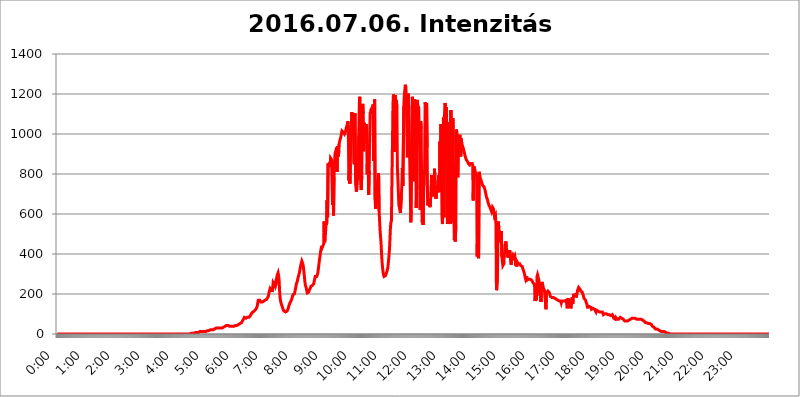
| Category | 2016.07.06. Intenzitás [W/m^2] |
|---|---|
| 0.0 | 0 |
| 0.0006944444444444445 | 0 |
| 0.001388888888888889 | 0 |
| 0.0020833333333333333 | 0 |
| 0.002777777777777778 | 0 |
| 0.003472222222222222 | 0 |
| 0.004166666666666667 | 0 |
| 0.004861111111111111 | 0 |
| 0.005555555555555556 | 0 |
| 0.0062499999999999995 | 0 |
| 0.006944444444444444 | 0 |
| 0.007638888888888889 | 0 |
| 0.008333333333333333 | 0 |
| 0.009027777777777779 | 0 |
| 0.009722222222222222 | 0 |
| 0.010416666666666666 | 0 |
| 0.011111111111111112 | 0 |
| 0.011805555555555555 | 0 |
| 0.012499999999999999 | 0 |
| 0.013194444444444444 | 0 |
| 0.013888888888888888 | 0 |
| 0.014583333333333332 | 0 |
| 0.015277777777777777 | 0 |
| 0.015972222222222224 | 0 |
| 0.016666666666666666 | 0 |
| 0.017361111111111112 | 0 |
| 0.018055555555555557 | 0 |
| 0.01875 | 0 |
| 0.019444444444444445 | 0 |
| 0.02013888888888889 | 0 |
| 0.020833333333333332 | 0 |
| 0.02152777777777778 | 0 |
| 0.022222222222222223 | 0 |
| 0.02291666666666667 | 0 |
| 0.02361111111111111 | 0 |
| 0.024305555555555556 | 0 |
| 0.024999999999999998 | 0 |
| 0.025694444444444447 | 0 |
| 0.02638888888888889 | 0 |
| 0.027083333333333334 | 0 |
| 0.027777777777777776 | 0 |
| 0.02847222222222222 | 0 |
| 0.029166666666666664 | 0 |
| 0.029861111111111113 | 0 |
| 0.030555555555555555 | 0 |
| 0.03125 | 0 |
| 0.03194444444444445 | 0 |
| 0.03263888888888889 | 0 |
| 0.03333333333333333 | 0 |
| 0.034027777777777775 | 0 |
| 0.034722222222222224 | 0 |
| 0.035416666666666666 | 0 |
| 0.036111111111111115 | 0 |
| 0.03680555555555556 | 0 |
| 0.0375 | 0 |
| 0.03819444444444444 | 0 |
| 0.03888888888888889 | 0 |
| 0.03958333333333333 | 0 |
| 0.04027777777777778 | 0 |
| 0.04097222222222222 | 0 |
| 0.041666666666666664 | 0 |
| 0.042361111111111106 | 0 |
| 0.04305555555555556 | 0 |
| 0.043750000000000004 | 0 |
| 0.044444444444444446 | 0 |
| 0.04513888888888889 | 0 |
| 0.04583333333333334 | 0 |
| 0.04652777777777778 | 0 |
| 0.04722222222222222 | 0 |
| 0.04791666666666666 | 0 |
| 0.04861111111111111 | 0 |
| 0.049305555555555554 | 0 |
| 0.049999999999999996 | 0 |
| 0.05069444444444445 | 0 |
| 0.051388888888888894 | 0 |
| 0.052083333333333336 | 0 |
| 0.05277777777777778 | 0 |
| 0.05347222222222222 | 0 |
| 0.05416666666666667 | 0 |
| 0.05486111111111111 | 0 |
| 0.05555555555555555 | 0 |
| 0.05625 | 0 |
| 0.05694444444444444 | 0 |
| 0.057638888888888885 | 0 |
| 0.05833333333333333 | 0 |
| 0.05902777777777778 | 0 |
| 0.059722222222222225 | 0 |
| 0.06041666666666667 | 0 |
| 0.061111111111111116 | 0 |
| 0.06180555555555556 | 0 |
| 0.0625 | 0 |
| 0.06319444444444444 | 0 |
| 0.06388888888888888 | 0 |
| 0.06458333333333334 | 0 |
| 0.06527777777777778 | 0 |
| 0.06597222222222222 | 0 |
| 0.06666666666666667 | 0 |
| 0.06736111111111111 | 0 |
| 0.06805555555555555 | 0 |
| 0.06874999999999999 | 0 |
| 0.06944444444444443 | 0 |
| 0.07013888888888889 | 0 |
| 0.07083333333333333 | 0 |
| 0.07152777777777779 | 0 |
| 0.07222222222222223 | 0 |
| 0.07291666666666667 | 0 |
| 0.07361111111111111 | 0 |
| 0.07430555555555556 | 0 |
| 0.075 | 0 |
| 0.07569444444444444 | 0 |
| 0.0763888888888889 | 0 |
| 0.07708333333333334 | 0 |
| 0.07777777777777778 | 0 |
| 0.07847222222222222 | 0 |
| 0.07916666666666666 | 0 |
| 0.0798611111111111 | 0 |
| 0.08055555555555556 | 0 |
| 0.08125 | 0 |
| 0.08194444444444444 | 0 |
| 0.08263888888888889 | 0 |
| 0.08333333333333333 | 0 |
| 0.08402777777777777 | 0 |
| 0.08472222222222221 | 0 |
| 0.08541666666666665 | 0 |
| 0.08611111111111112 | 0 |
| 0.08680555555555557 | 0 |
| 0.08750000000000001 | 0 |
| 0.08819444444444445 | 0 |
| 0.08888888888888889 | 0 |
| 0.08958333333333333 | 0 |
| 0.09027777777777778 | 0 |
| 0.09097222222222222 | 0 |
| 0.09166666666666667 | 0 |
| 0.09236111111111112 | 0 |
| 0.09305555555555556 | 0 |
| 0.09375 | 0 |
| 0.09444444444444444 | 0 |
| 0.09513888888888888 | 0 |
| 0.09583333333333333 | 0 |
| 0.09652777777777777 | 0 |
| 0.09722222222222222 | 0 |
| 0.09791666666666667 | 0 |
| 0.09861111111111111 | 0 |
| 0.09930555555555555 | 0 |
| 0.09999999999999999 | 0 |
| 0.10069444444444443 | 0 |
| 0.1013888888888889 | 0 |
| 0.10208333333333335 | 0 |
| 0.10277777777777779 | 0 |
| 0.10347222222222223 | 0 |
| 0.10416666666666667 | 0 |
| 0.10486111111111111 | 0 |
| 0.10555555555555556 | 0 |
| 0.10625 | 0 |
| 0.10694444444444444 | 0 |
| 0.1076388888888889 | 0 |
| 0.10833333333333334 | 0 |
| 0.10902777777777778 | 0 |
| 0.10972222222222222 | 0 |
| 0.1111111111111111 | 0 |
| 0.11180555555555556 | 0 |
| 0.11180555555555556 | 0 |
| 0.1125 | 0 |
| 0.11319444444444444 | 0 |
| 0.11388888888888889 | 0 |
| 0.11458333333333333 | 0 |
| 0.11527777777777777 | 0 |
| 0.11597222222222221 | 0 |
| 0.11666666666666665 | 0 |
| 0.1173611111111111 | 0 |
| 0.11805555555555557 | 0 |
| 0.11944444444444445 | 0 |
| 0.12013888888888889 | 0 |
| 0.12083333333333333 | 0 |
| 0.12152777777777778 | 0 |
| 0.12222222222222223 | 0 |
| 0.12291666666666667 | 0 |
| 0.12291666666666667 | 0 |
| 0.12361111111111112 | 0 |
| 0.12430555555555556 | 0 |
| 0.125 | 0 |
| 0.12569444444444444 | 0 |
| 0.12638888888888888 | 0 |
| 0.12708333333333333 | 0 |
| 0.16875 | 0 |
| 0.12847222222222224 | 0 |
| 0.12916666666666668 | 0 |
| 0.12986111111111112 | 0 |
| 0.13055555555555556 | 0 |
| 0.13125 | 0 |
| 0.13194444444444445 | 0 |
| 0.1326388888888889 | 0 |
| 0.13333333333333333 | 0 |
| 0.13402777777777777 | 0 |
| 0.13402777777777777 | 0 |
| 0.13472222222222222 | 0 |
| 0.13541666666666666 | 0 |
| 0.1361111111111111 | 0 |
| 0.13749999999999998 | 0 |
| 0.13819444444444443 | 0 |
| 0.1388888888888889 | 0 |
| 0.13958333333333334 | 0 |
| 0.14027777777777778 | 0 |
| 0.14097222222222222 | 0 |
| 0.14166666666666666 | 0 |
| 0.1423611111111111 | 0 |
| 0.14305555555555557 | 0 |
| 0.14375000000000002 | 0 |
| 0.14444444444444446 | 0 |
| 0.1451388888888889 | 0 |
| 0.1451388888888889 | 0 |
| 0.14652777777777778 | 0 |
| 0.14722222222222223 | 0 |
| 0.14791666666666667 | 0 |
| 0.1486111111111111 | 0 |
| 0.14930555555555555 | 0 |
| 0.15 | 0 |
| 0.15069444444444444 | 0 |
| 0.15138888888888888 | 0 |
| 0.15208333333333332 | 0 |
| 0.15277777777777776 | 0 |
| 0.15347222222222223 | 0 |
| 0.15416666666666667 | 0 |
| 0.15486111111111112 | 0 |
| 0.15555555555555556 | 0 |
| 0.15625 | 0 |
| 0.15694444444444444 | 0 |
| 0.15763888888888888 | 0 |
| 0.15833333333333333 | 0 |
| 0.15902777777777777 | 0 |
| 0.15972222222222224 | 0 |
| 0.16041666666666668 | 0 |
| 0.16111111111111112 | 0 |
| 0.16180555555555556 | 0 |
| 0.1625 | 0 |
| 0.16319444444444445 | 0 |
| 0.1638888888888889 | 0 |
| 0.16458333333333333 | 0 |
| 0.16527777777777777 | 0 |
| 0.16597222222222222 | 0 |
| 0.16666666666666666 | 0 |
| 0.1673611111111111 | 0 |
| 0.16805555555555554 | 0 |
| 0.16874999999999998 | 0 |
| 0.16944444444444443 | 0 |
| 0.17013888888888887 | 0 |
| 0.1708333333333333 | 0 |
| 0.17152777777777775 | 0 |
| 0.17222222222222225 | 0 |
| 0.1729166666666667 | 0 |
| 0.17361111111111113 | 0 |
| 0.17430555555555557 | 0 |
| 0.17500000000000002 | 0 |
| 0.17569444444444446 | 0 |
| 0.1763888888888889 | 0 |
| 0.17708333333333334 | 0 |
| 0.17777777777777778 | 0 |
| 0.17847222222222223 | 0 |
| 0.17916666666666667 | 0 |
| 0.1798611111111111 | 0 |
| 0.18055555555555555 | 0 |
| 0.18125 | 0 |
| 0.18194444444444444 | 0 |
| 0.1826388888888889 | 0 |
| 0.18333333333333335 | 0 |
| 0.1840277777777778 | 0 |
| 0.18472222222222223 | 0 |
| 0.18541666666666667 | 0 |
| 0.18611111111111112 | 0 |
| 0.18680555555555556 | 3.525 |
| 0.1875 | 3.525 |
| 0.18819444444444444 | 3.525 |
| 0.18888888888888888 | 3.525 |
| 0.18958333333333333 | 3.525 |
| 0.19027777777777777 | 3.525 |
| 0.1909722222222222 | 3.525 |
| 0.19166666666666665 | 3.525 |
| 0.19236111111111112 | 3.525 |
| 0.19305555555555554 | 7.887 |
| 0.19375 | 7.887 |
| 0.19444444444444445 | 7.887 |
| 0.1951388888888889 | 7.887 |
| 0.19583333333333333 | 7.887 |
| 0.19652777777777777 | 7.887 |
| 0.19722222222222222 | 12.257 |
| 0.19791666666666666 | 7.887 |
| 0.1986111111111111 | 7.887 |
| 0.19930555555555554 | 12.257 |
| 0.19999999999999998 | 12.257 |
| 0.20069444444444443 | 12.257 |
| 0.20138888888888887 | 12.257 |
| 0.2020833333333333 | 12.257 |
| 0.2027777777777778 | 12.257 |
| 0.2034722222222222 | 12.257 |
| 0.2041666666666667 | 12.257 |
| 0.20486111111111113 | 12.257 |
| 0.20555555555555557 | 12.257 |
| 0.20625000000000002 | 12.257 |
| 0.20694444444444446 | 12.257 |
| 0.2076388888888889 | 12.257 |
| 0.20833333333333334 | 12.257 |
| 0.20902777777777778 | 12.257 |
| 0.20972222222222223 | 12.257 |
| 0.21041666666666667 | 16.636 |
| 0.2111111111111111 | 16.636 |
| 0.21180555555555555 | 16.636 |
| 0.2125 | 16.636 |
| 0.21319444444444444 | 16.636 |
| 0.2138888888888889 | 16.636 |
| 0.21458333333333335 | 21.024 |
| 0.2152777777777778 | 21.024 |
| 0.21597222222222223 | 21.024 |
| 0.21666666666666667 | 21.024 |
| 0.21736111111111112 | 21.024 |
| 0.21805555555555556 | 21.024 |
| 0.21875 | 21.024 |
| 0.21944444444444444 | 25.419 |
| 0.22013888888888888 | 25.419 |
| 0.22083333333333333 | 25.419 |
| 0.22152777777777777 | 29.823 |
| 0.2222222222222222 | 29.823 |
| 0.22291666666666665 | 29.823 |
| 0.2236111111111111 | 29.823 |
| 0.22430555555555556 | 29.823 |
| 0.225 | 29.823 |
| 0.22569444444444445 | 29.823 |
| 0.2263888888888889 | 29.823 |
| 0.22708333333333333 | 29.823 |
| 0.22777777777777777 | 29.823 |
| 0.22847222222222222 | 29.823 |
| 0.22916666666666666 | 29.823 |
| 0.2298611111111111 | 29.823 |
| 0.23055555555555554 | 29.823 |
| 0.23124999999999998 | 29.823 |
| 0.23194444444444443 | 34.234 |
| 0.23263888888888887 | 34.234 |
| 0.2333333333333333 | 34.234 |
| 0.2340277777777778 | 38.653 |
| 0.2347222222222222 | 38.653 |
| 0.2354166666666667 | 38.653 |
| 0.23611111111111113 | 38.653 |
| 0.23680555555555557 | 38.653 |
| 0.23750000000000002 | 43.079 |
| 0.23819444444444446 | 43.079 |
| 0.2388888888888889 | 43.079 |
| 0.23958333333333334 | 43.079 |
| 0.24027777777777778 | 43.079 |
| 0.24097222222222223 | 43.079 |
| 0.24166666666666667 | 38.653 |
| 0.2423611111111111 | 38.653 |
| 0.24305555555555555 | 38.653 |
| 0.24375 | 38.653 |
| 0.24444444444444446 | 38.653 |
| 0.24513888888888888 | 38.653 |
| 0.24583333333333335 | 38.653 |
| 0.2465277777777778 | 38.653 |
| 0.24722222222222223 | 38.653 |
| 0.24791666666666667 | 38.653 |
| 0.24861111111111112 | 38.653 |
| 0.24930555555555556 | 38.653 |
| 0.25 | 43.079 |
| 0.25069444444444444 | 43.079 |
| 0.2513888888888889 | 43.079 |
| 0.2520833333333333 | 43.079 |
| 0.25277777777777777 | 43.079 |
| 0.2534722222222222 | 47.511 |
| 0.25416666666666665 | 47.511 |
| 0.2548611111111111 | 47.511 |
| 0.2555555555555556 | 51.951 |
| 0.25625000000000003 | 51.951 |
| 0.2569444444444445 | 51.951 |
| 0.2576388888888889 | 56.398 |
| 0.25833333333333336 | 56.398 |
| 0.2590277777777778 | 60.85 |
| 0.25972222222222224 | 65.31 |
| 0.2604166666666667 | 69.775 |
| 0.2611111111111111 | 74.246 |
| 0.26180555555555557 | 78.722 |
| 0.2625 | 83.205 |
| 0.26319444444444445 | 83.205 |
| 0.2638888888888889 | 78.722 |
| 0.26458333333333334 | 78.722 |
| 0.2652777777777778 | 83.205 |
| 0.2659722222222222 | 83.205 |
| 0.26666666666666666 | 83.205 |
| 0.2673611111111111 | 83.205 |
| 0.26805555555555555 | 83.205 |
| 0.26875 | 83.205 |
| 0.26944444444444443 | 83.205 |
| 0.2701388888888889 | 87.692 |
| 0.2708333333333333 | 92.184 |
| 0.27152777777777776 | 96.682 |
| 0.2722222222222222 | 101.184 |
| 0.27291666666666664 | 105.69 |
| 0.2736111111111111 | 105.69 |
| 0.2743055555555555 | 110.201 |
| 0.27499999999999997 | 110.201 |
| 0.27569444444444446 | 110.201 |
| 0.27638888888888885 | 114.716 |
| 0.27708333333333335 | 119.235 |
| 0.2777777777777778 | 119.235 |
| 0.27847222222222223 | 123.758 |
| 0.2791666666666667 | 128.284 |
| 0.2798611111111111 | 132.814 |
| 0.28055555555555556 | 141.884 |
| 0.28125 | 146.423 |
| 0.28194444444444444 | 169.156 |
| 0.2826388888888889 | 164.605 |
| 0.2833333333333333 | 169.156 |
| 0.28402777777777777 | 169.156 |
| 0.2847222222222222 | 164.605 |
| 0.28541666666666665 | 160.056 |
| 0.28611111111111115 | 160.056 |
| 0.28680555555555554 | 160.056 |
| 0.28750000000000003 | 160.056 |
| 0.2881944444444445 | 164.605 |
| 0.2888888888888889 | 164.605 |
| 0.28958333333333336 | 164.605 |
| 0.2902777777777778 | 164.605 |
| 0.29097222222222224 | 164.605 |
| 0.2916666666666667 | 169.156 |
| 0.2923611111111111 | 169.156 |
| 0.29305555555555557 | 169.156 |
| 0.29375 | 173.709 |
| 0.29444444444444445 | 173.709 |
| 0.2951388888888889 | 178.264 |
| 0.29583333333333334 | 187.378 |
| 0.2965277777777778 | 196.497 |
| 0.2972222222222222 | 210.182 |
| 0.29791666666666666 | 219.309 |
| 0.2986111111111111 | 228.436 |
| 0.29930555555555555 | 228.436 |
| 0.3 | 223.873 |
| 0.30069444444444443 | 219.309 |
| 0.3013888888888889 | 210.182 |
| 0.3020833333333333 | 228.436 |
| 0.30277777777777776 | 255.813 |
| 0.3034722222222222 | 260.373 |
| 0.30416666666666664 | 251.251 |
| 0.3048611111111111 | 242.127 |
| 0.3055555555555555 | 251.251 |
| 0.30624999999999997 | 242.127 |
| 0.3069444444444444 | 251.251 |
| 0.3076388888888889 | 274.047 |
| 0.30833333333333335 | 292.259 |
| 0.3090277777777778 | 296.808 |
| 0.30972222222222223 | 305.898 |
| 0.3104166666666667 | 292.259 |
| 0.3111111111111111 | 274.047 |
| 0.31180555555555556 | 219.309 |
| 0.3125 | 182.82 |
| 0.31319444444444444 | 164.605 |
| 0.3138888888888889 | 155.509 |
| 0.3145833333333333 | 146.423 |
| 0.31527777777777777 | 141.884 |
| 0.3159722222222222 | 132.814 |
| 0.31666666666666665 | 123.758 |
| 0.31736111111111115 | 119.235 |
| 0.31805555555555554 | 114.716 |
| 0.31875000000000003 | 110.201 |
| 0.3194444444444445 | 110.201 |
| 0.3201388888888889 | 110.201 |
| 0.32083333333333336 | 110.201 |
| 0.3215277777777778 | 110.201 |
| 0.32222222222222224 | 114.716 |
| 0.3229166666666667 | 119.235 |
| 0.3236111111111111 | 123.758 |
| 0.32430555555555557 | 132.814 |
| 0.325 | 141.884 |
| 0.32569444444444445 | 146.423 |
| 0.3263888888888889 | 155.509 |
| 0.32708333333333334 | 160.056 |
| 0.3277777777777778 | 164.605 |
| 0.3284722222222222 | 169.156 |
| 0.32916666666666666 | 178.264 |
| 0.3298611111111111 | 187.378 |
| 0.33055555555555555 | 196.497 |
| 0.33125 | 201.058 |
| 0.33194444444444443 | 196.497 |
| 0.3326388888888889 | 201.058 |
| 0.3333333333333333 | 205.62 |
| 0.3340277777777778 | 223.873 |
| 0.3347222222222222 | 237.564 |
| 0.3354166666666667 | 251.251 |
| 0.3361111111111111 | 255.813 |
| 0.3368055555555556 | 264.932 |
| 0.33749999999999997 | 278.603 |
| 0.33819444444444446 | 287.709 |
| 0.33888888888888885 | 296.808 |
| 0.33958333333333335 | 305.898 |
| 0.34027777777777773 | 319.517 |
| 0.34097222222222223 | 333.113 |
| 0.3416666666666666 | 346.682 |
| 0.3423611111111111 | 355.712 |
| 0.3430555555555555 | 364.728 |
| 0.34375 | 369.23 |
| 0.3444444444444445 | 351.198 |
| 0.3451388888888889 | 337.639 |
| 0.3458333333333334 | 314.98 |
| 0.34652777777777777 | 292.259 |
| 0.34722222222222227 | 264.932 |
| 0.34791666666666665 | 246.689 |
| 0.34861111111111115 | 237.564 |
| 0.34930555555555554 | 228.436 |
| 0.35000000000000003 | 214.746 |
| 0.3506944444444444 | 205.62 |
| 0.3513888888888889 | 201.058 |
| 0.3520833333333333 | 201.058 |
| 0.3527777777777778 | 210.182 |
| 0.3534722222222222 | 219.309 |
| 0.3541666666666667 | 223.873 |
| 0.3548611111111111 | 228.436 |
| 0.35555555555555557 | 237.564 |
| 0.35625 | 242.127 |
| 0.35694444444444445 | 242.127 |
| 0.3576388888888889 | 242.127 |
| 0.35833333333333334 | 242.127 |
| 0.3590277777777778 | 246.689 |
| 0.3597222222222222 | 251.251 |
| 0.36041666666666666 | 264.932 |
| 0.3611111111111111 | 274.047 |
| 0.36180555555555555 | 287.709 |
| 0.3625 | 292.259 |
| 0.36319444444444443 | 292.259 |
| 0.3638888888888889 | 287.709 |
| 0.3645833333333333 | 292.259 |
| 0.3652777777777778 | 301.354 |
| 0.3659722222222222 | 319.517 |
| 0.3666666666666667 | 337.639 |
| 0.3673611111111111 | 360.221 |
| 0.3680555555555556 | 378.224 |
| 0.36874999999999997 | 396.164 |
| 0.36944444444444446 | 414.035 |
| 0.37013888888888885 | 427.39 |
| 0.37083333333333335 | 440.702 |
| 0.37152777777777773 | 431.833 |
| 0.37222222222222223 | 431.833 |
| 0.3729166666666666 | 436.27 |
| 0.3736111111111111 | 449.551 |
| 0.3743055555555555 | 562.53 |
| 0.375 | 458.38 |
| 0.3756944444444445 | 475.972 |
| 0.3763888888888889 | 515.223 |
| 0.3770833333333334 | 558.261 |
| 0.37777777777777777 | 545.416 |
| 0.37847222222222227 | 667.123 |
| 0.37916666666666665 | 583.779 |
| 0.37986111111111115 | 853.029 |
| 0.38055555555555554 | 845.365 |
| 0.38125000000000003 | 833.834 |
| 0.3819444444444444 | 856.855 |
| 0.3826388888888889 | 837.682 |
| 0.3833333333333333 | 879.719 |
| 0.3840277777777778 | 879.719 |
| 0.3847222222222222 | 872.114 |
| 0.3854166666666667 | 875.918 |
| 0.3861111111111111 | 646.537 |
| 0.38680555555555557 | 860.676 |
| 0.3875 | 592.233 |
| 0.38819444444444445 | 787.258 |
| 0.3888888888888889 | 853.029 |
| 0.38958333333333334 | 902.447 |
| 0.3902777777777778 | 906.223 |
| 0.3909722222222222 | 917.534 |
| 0.39166666666666666 | 932.576 |
| 0.3923611111111111 | 810.641 |
| 0.39305555555555555 | 940.082 |
| 0.39375 | 917.534 |
| 0.39444444444444443 | 887.309 |
| 0.3951388888888889 | 947.58 |
| 0.3958333333333333 | 958.814 |
| 0.3965277777777778 | 970.034 |
| 0.3972222222222222 | 977.508 |
| 0.3979166666666667 | 988.714 |
| 0.3986111111111111 | 988.714 |
| 0.3993055555555556 | 1014.852 |
| 0.39999999999999997 | 1011.118 |
| 0.40069444444444446 | 1014.852 |
| 0.40138888888888885 | 1007.383 |
| 0.40208333333333335 | 1003.65 |
| 0.40277777777777773 | 999.916 |
| 0.40347222222222223 | 1003.65 |
| 0.4041666666666666 | 1011.118 |
| 0.4048611111111111 | 1022.323 |
| 0.4055555555555555 | 1033.537 |
| 0.40625 | 1041.019 |
| 0.4069444444444445 | 1048.508 |
| 0.4076388888888889 | 1063.51 |
| 0.4083333333333334 | 992.448 |
| 0.40902777777777777 | 767.62 |
| 0.40972222222222227 | 818.392 |
| 0.41041666666666665 | 751.803 |
| 0.41111111111111115 | 849.199 |
| 0.41180555555555554 | 1041.019 |
| 0.41250000000000003 | 1033.537 |
| 0.4131944444444444 | 1108.816 |
| 0.4138888888888889 | 1108.816 |
| 0.4145833333333333 | 1112.618 |
| 0.4152777777777778 | 1067.267 |
| 0.4159722222222222 | 860.676 |
| 0.4166666666666667 | 849.199 |
| 0.4173611111111111 | 1105.019 |
| 0.41805555555555557 | 1101.226 |
| 0.41875 | 743.859 |
| 0.41944444444444445 | 711.832 |
| 0.4201388888888889 | 723.889 |
| 0.42083333333333334 | 759.723 |
| 0.4215277777777778 | 806.757 |
| 0.4222222222222222 | 795.074 |
| 0.42291666666666666 | 992.448 |
| 0.4236111111111111 | 1135.543 |
| 0.42430555555555555 | 1186.03 |
| 0.425 | 826.123 |
| 0.42569444444444443 | 743.859 |
| 0.4263888888888889 | 719.877 |
| 0.4270833333333333 | 791.169 |
| 0.4277777777777778 | 1093.653 |
| 0.4284722222222222 | 1150.946 |
| 0.4291666666666667 | 1101.226 |
| 0.4298611111111111 | 913.766 |
| 0.4305555555555556 | 1056.004 |
| 0.43124999999999997 | 999.916 |
| 0.43194444444444446 | 1022.323 |
| 0.43263888888888885 | 996.182 |
| 0.43333333333333335 | 1048.508 |
| 0.43402777777777773 | 955.071 |
| 0.43472222222222223 | 798.974 |
| 0.4354166666666666 | 947.58 |
| 0.4361111111111111 | 833.834 |
| 0.4368055555555555 | 695.666 |
| 0.4375 | 814.519 |
| 0.4381944444444445 | 996.182 |
| 0.4388888888888889 | 1108.816 |
| 0.4395833333333334 | 1101.226 |
| 0.44027777777777777 | 1124.056 |
| 0.44097222222222227 | 1124.056 |
| 0.44166666666666665 | 1127.879 |
| 0.44236111111111115 | 1135.543 |
| 0.44305555555555554 | 1147.086 |
| 0.44375000000000003 | 864.493 |
| 0.4444444444444444 | 958.814 |
| 0.4451388888888889 | 1174.263 |
| 0.4458333333333333 | 671.22 |
| 0.4465277777777778 | 625.784 |
| 0.4472222222222222 | 621.613 |
| 0.4479166666666667 | 625.784 |
| 0.4486111111111111 | 711.832 |
| 0.44930555555555557 | 767.62 |
| 0.45 | 755.766 |
| 0.45069444444444445 | 802.868 |
| 0.4513888888888889 | 617.436 |
| 0.45208333333333334 | 566.793 |
| 0.4527777777777778 | 519.555 |
| 0.4534722222222222 | 484.735 |
| 0.45416666666666666 | 453.968 |
| 0.4548611111111111 | 400.638 |
| 0.45555555555555555 | 360.221 |
| 0.45625 | 333.113 |
| 0.45694444444444443 | 310.44 |
| 0.4576388888888889 | 296.808 |
| 0.4583333333333333 | 287.709 |
| 0.4590277777777778 | 283.156 |
| 0.4597222222222222 | 283.156 |
| 0.4604166666666667 | 292.259 |
| 0.4611111111111111 | 296.808 |
| 0.4618055555555556 | 305.898 |
| 0.46249999999999997 | 310.44 |
| 0.46319444444444446 | 324.052 |
| 0.46388888888888885 | 337.639 |
| 0.46458333333333335 | 364.728 |
| 0.46527777777777773 | 391.685 |
| 0.46597222222222223 | 422.943 |
| 0.4666666666666666 | 475.972 |
| 0.4673611111111111 | 536.82 |
| 0.4680555555555555 | 558.261 |
| 0.46875 | 566.793 |
| 0.4694444444444445 | 775.492 |
| 0.4701388888888889 | 947.58 |
| 0.4708333333333334 | 1143.232 |
| 0.47152777777777777 | 1197.876 |
| 0.47222222222222227 | 1189.969 |
| 0.47291666666666665 | 909.996 |
| 0.47361111111111115 | 1093.653 |
| 0.47430555555555554 | 1193.918 |
| 0.47500000000000003 | 1131.708 |
| 0.4756944444444444 | 1170.358 |
| 0.4763888888888889 | 1127.879 |
| 0.4770833333333333 | 829.981 |
| 0.4777777777777778 | 771.559 |
| 0.4784722222222222 | 703.762 |
| 0.4791666666666667 | 642.4 |
| 0.4798611111111111 | 634.105 |
| 0.48055555555555557 | 634.105 |
| 0.48125 | 604.864 |
| 0.48194444444444445 | 600.661 |
| 0.4826388888888889 | 691.608 |
| 0.48333333333333334 | 743.859 |
| 0.4840277777777778 | 829.981 |
| 0.4847222222222222 | 739.877 |
| 0.48541666666666666 | 743.859 |
| 0.4861111111111111 | 1139.384 |
| 0.48680555555555555 | 1193.918 |
| 0.4875 | 1189.969 |
| 0.48819444444444443 | 1246.176 |
| 0.4888888888888889 | 1229.899 |
| 0.4895833333333333 | 1189.969 |
| 0.4902777777777778 | 1029.798 |
| 0.4909722222222222 | 883.516 |
| 0.4916666666666667 | 917.534 |
| 0.4923611111111111 | 1201.843 |
| 0.4930555555555556 | 1112.618 |
| 0.49374999999999997 | 1116.426 |
| 0.49444444444444446 | 1116.426 |
| 0.49513888888888885 | 719.877 |
| 0.49583333333333335 | 558.261 |
| 0.49652777777777773 | 617.436 |
| 0.49722222222222223 | 962.555 |
| 0.4979166666666666 | 1186.03 |
| 0.4986111111111111 | 1166.46 |
| 0.4993055555555555 | 1044.762 |
| 0.5 | 763.674 |
| 0.5006944444444444 | 814.519 |
| 0.5013888888888889 | 1174.263 |
| 0.5020833333333333 | 1174.263 |
| 0.5027777777777778 | 902.447 |
| 0.5034722222222222 | 629.948 |
| 0.5041666666666667 | 743.859 |
| 0.5048611111111111 | 1170.358 |
| 0.5055555555555555 | 1143.232 |
| 0.50625 | 1139.384 |
| 0.5069444444444444 | 1131.708 |
| 0.5076388888888889 | 1127.879 |
| 0.5083333333333333 | 928.819 |
| 0.5090277777777777 | 621.613 |
| 0.5097222222222222 | 1063.51 |
| 0.5104166666666666 | 1026.06 |
| 0.5111111111111112 | 719.877 |
| 0.5118055555555555 | 558.261 |
| 0.5125000000000001 | 579.542 |
| 0.5131944444444444 | 545.416 |
| 0.513888888888889 | 735.89 |
| 0.5145833333333333 | 743.859 |
| 0.5152777777777778 | 833.834 |
| 0.5159722222222222 | 1158.689 |
| 0.5166666666666667 | 1139.384 |
| 0.517361111111111 | 1139.384 |
| 0.5180555555555556 | 1154.814 |
| 0.5187499999999999 | 932.576 |
| 0.5194444444444445 | 642.4 |
| 0.5201388888888888 | 638.256 |
| 0.5208333333333334 | 654.791 |
| 0.5215277777777778 | 663.019 |
| 0.5222222222222223 | 642.4 |
| 0.5229166666666667 | 634.105 |
| 0.5236111111111111 | 671.22 |
| 0.5243055555555556 | 671.22 |
| 0.525 | 795.074 |
| 0.5256944444444445 | 699.717 |
| 0.5263888888888889 | 687.544 |
| 0.5270833333333333 | 747.834 |
| 0.5277777777777778 | 727.896 |
| 0.5284722222222222 | 695.666 |
| 0.5291666666666667 | 826.123 |
| 0.5298611111111111 | 739.877 |
| 0.5305555555555556 | 687.544 |
| 0.53125 | 675.311 |
| 0.5319444444444444 | 679.395 |
| 0.5326388888888889 | 739.877 |
| 0.5333333333333333 | 719.877 |
| 0.5340277777777778 | 707.8 |
| 0.5347222222222222 | 795.074 |
| 0.5354166666666667 | 735.89 |
| 0.5361111111111111 | 711.832 |
| 0.5368055555555555 | 962.555 |
| 0.5375 | 810.641 |
| 0.5381944444444444 | 1048.508 |
| 0.5388888888888889 | 913.766 |
| 0.5395833333333333 | 588.009 |
| 0.5402777777777777 | 549.704 |
| 0.5409722222222222 | 629.948 |
| 0.5416666666666666 | 1082.324 |
| 0.5423611111111112 | 583.779 |
| 0.5430555555555555 | 1086.097 |
| 0.5437500000000001 | 1154.814 |
| 0.5444444444444444 | 1143.232 |
| 0.545138888888889 | 1124.056 |
| 0.5458333333333333 | 1135.543 |
| 0.5465277777777778 | 845.365 |
| 0.5472222222222222 | 549.704 |
| 0.5479166666666667 | 695.666 |
| 0.548611111111111 | 699.717 |
| 0.5493055555555556 | 1059.756 |
| 0.5499999999999999 | 767.62 |
| 0.5506944444444445 | 583.779 |
| 0.5513888888888888 | 549.704 |
| 0.5520833333333334 | 1120.238 |
| 0.5527777777777778 | 558.261 |
| 0.5534722222222223 | 642.4 |
| 0.5541666666666667 | 731.896 |
| 0.5548611111111111 | 1078.555 |
| 0.5555555555555556 | 932.576 |
| 0.55625 | 592.233 |
| 0.5569444444444445 | 471.582 |
| 0.5576388888888889 | 536.82 |
| 0.5583333333333333 | 462.786 |
| 0.5590277777777778 | 545.416 |
| 0.5597222222222222 | 1022.323 |
| 0.5604166666666667 | 1007.383 |
| 0.5611111111111111 | 992.448 |
| 0.5618055555555556 | 783.342 |
| 0.5625 | 947.58 |
| 0.5631944444444444 | 909.996 |
| 0.5638888888888889 | 921.298 |
| 0.5645833333333333 | 996.182 |
| 0.5652777777777778 | 973.772 |
| 0.5659722222222222 | 887.309 |
| 0.5666666666666667 | 977.508 |
| 0.5673611111111111 | 951.327 |
| 0.5680555555555555 | 955.071 |
| 0.56875 | 947.58 |
| 0.5694444444444444 | 928.819 |
| 0.5701388888888889 | 917.534 |
| 0.5708333333333333 | 909.996 |
| 0.5715277777777777 | 898.668 |
| 0.5722222222222222 | 887.309 |
| 0.5729166666666666 | 883.516 |
| 0.5736111111111112 | 872.114 |
| 0.5743055555555555 | 868.305 |
| 0.5750000000000001 | 868.305 |
| 0.5756944444444444 | 860.676 |
| 0.576388888888889 | 853.029 |
| 0.5770833333333333 | 849.199 |
| 0.5777777777777778 | 849.199 |
| 0.5784722222222222 | 845.365 |
| 0.5791666666666667 | 849.199 |
| 0.579861111111111 | 853.029 |
| 0.5805555555555556 | 853.029 |
| 0.5812499999999999 | 853.029 |
| 0.5819444444444445 | 853.029 |
| 0.5826388888888888 | 845.365 |
| 0.5833333333333334 | 667.123 |
| 0.5840277777777778 | 759.723 |
| 0.5847222222222223 | 837.682 |
| 0.5854166666666667 | 826.123 |
| 0.5861111111111111 | 814.519 |
| 0.5868055555555556 | 802.868 |
| 0.5875 | 798.974 |
| 0.5881944444444445 | 791.169 |
| 0.5888888888888889 | 387.202 |
| 0.5895833333333333 | 506.542 |
| 0.5902777777777778 | 467.187 |
| 0.5909722222222222 | 378.224 |
| 0.5916666666666667 | 810.641 |
| 0.5923611111111111 | 798.974 |
| 0.5930555555555556 | 783.342 |
| 0.59375 | 783.342 |
| 0.5944444444444444 | 767.62 |
| 0.5951388888888889 | 759.723 |
| 0.5958333333333333 | 751.803 |
| 0.5965277777777778 | 743.859 |
| 0.5972222222222222 | 747.834 |
| 0.5979166666666667 | 743.859 |
| 0.5986111111111111 | 735.89 |
| 0.5993055555555555 | 727.896 |
| 0.6 | 719.877 |
| 0.6006944444444444 | 707.8 |
| 0.6013888888888889 | 695.666 |
| 0.6020833333333333 | 683.473 |
| 0.6027777777777777 | 679.395 |
| 0.6034722222222222 | 671.22 |
| 0.6041666666666666 | 658.909 |
| 0.6048611111111112 | 650.667 |
| 0.6055555555555555 | 642.4 |
| 0.6062500000000001 | 638.256 |
| 0.6069444444444444 | 634.105 |
| 0.607638888888889 | 625.784 |
| 0.6083333333333333 | 621.613 |
| 0.6090277777777778 | 613.252 |
| 0.6097222222222222 | 613.252 |
| 0.6104166666666667 | 634.105 |
| 0.611111111111111 | 629.948 |
| 0.6118055555555556 | 625.784 |
| 0.6124999999999999 | 621.613 |
| 0.6131944444444445 | 588.009 |
| 0.6138888888888888 | 583.779 |
| 0.6145833333333334 | 596.45 |
| 0.6152777777777778 | 549.704 |
| 0.6159722222222223 | 219.309 |
| 0.6166666666666667 | 228.436 |
| 0.6173611111111111 | 264.932 |
| 0.6180555555555556 | 506.542 |
| 0.61875 | 562.53 |
| 0.6194444444444445 | 515.223 |
| 0.6201388888888889 | 502.192 |
| 0.6208333333333333 | 458.38 |
| 0.6215277777777778 | 458.38 |
| 0.6222222222222222 | 458.38 |
| 0.6229166666666667 | 515.223 |
| 0.6236111111111111 | 387.202 |
| 0.6243055555555556 | 391.685 |
| 0.625 | 342.162 |
| 0.6256944444444444 | 346.682 |
| 0.6263888888888889 | 351.198 |
| 0.6270833333333333 | 409.574 |
| 0.6277777777777778 | 400.638 |
| 0.6284722222222222 | 445.129 |
| 0.6291666666666667 | 462.786 |
| 0.6298611111111111 | 431.833 |
| 0.6305555555555555 | 405.108 |
| 0.63125 | 382.715 |
| 0.6319444444444444 | 387.202 |
| 0.6326388888888889 | 378.224 |
| 0.6333333333333333 | 405.108 |
| 0.6340277777777777 | 409.574 |
| 0.6347222222222222 | 418.492 |
| 0.6354166666666666 | 387.202 |
| 0.6361111111111112 | 355.712 |
| 0.6368055555555555 | 346.682 |
| 0.6375000000000001 | 387.202 |
| 0.6381944444444444 | 387.202 |
| 0.638888888888889 | 396.164 |
| 0.6395833333333333 | 396.164 |
| 0.6402777777777778 | 382.715 |
| 0.6409722222222222 | 382.715 |
| 0.6416666666666667 | 391.685 |
| 0.642361111111111 | 373.729 |
| 0.6430555555555556 | 342.162 |
| 0.6437499999999999 | 360.221 |
| 0.6444444444444445 | 337.639 |
| 0.6451388888888888 | 360.221 |
| 0.6458333333333334 | 360.221 |
| 0.6465277777777778 | 351.198 |
| 0.6472222222222223 | 355.712 |
| 0.6479166666666667 | 355.712 |
| 0.6486111111111111 | 351.198 |
| 0.6493055555555556 | 351.198 |
| 0.65 | 342.162 |
| 0.6506944444444445 | 342.162 |
| 0.6513888888888889 | 342.162 |
| 0.6520833333333333 | 337.639 |
| 0.6527777777777778 | 328.584 |
| 0.6534722222222222 | 324.052 |
| 0.6541666666666667 | 314.98 |
| 0.6548611111111111 | 310.44 |
| 0.6555555555555556 | 296.808 |
| 0.65625 | 283.156 |
| 0.6569444444444444 | 274.047 |
| 0.6576388888888889 | 278.603 |
| 0.6583333333333333 | 287.709 |
| 0.6590277777777778 | 269.49 |
| 0.6597222222222222 | 274.047 |
| 0.6604166666666667 | 274.047 |
| 0.6611111111111111 | 274.047 |
| 0.6618055555555555 | 274.047 |
| 0.6625 | 274.047 |
| 0.6631944444444444 | 274.047 |
| 0.6638888888888889 | 274.047 |
| 0.6645833333333333 | 274.047 |
| 0.6652777777777777 | 269.49 |
| 0.6659722222222222 | 264.932 |
| 0.6666666666666666 | 264.932 |
| 0.6673611111111111 | 255.813 |
| 0.6680555555555556 | 251.251 |
| 0.6687500000000001 | 251.251 |
| 0.6694444444444444 | 246.689 |
| 0.6701388888888888 | 164.605 |
| 0.6708333333333334 | 201.058 |
| 0.6715277777777778 | 169.156 |
| 0.6722222222222222 | 182.82 |
| 0.6729166666666666 | 287.709 |
| 0.6736111111111112 | 296.808 |
| 0.6743055555555556 | 287.709 |
| 0.6749999999999999 | 274.047 |
| 0.6756944444444444 | 264.932 |
| 0.6763888888888889 | 260.373 |
| 0.6770833333333334 | 191.937 |
| 0.6777777777777777 | 219.309 |
| 0.6784722222222223 | 160.056 |
| 0.6791666666666667 | 251.251 |
| 0.6798611111111111 | 260.373 |
| 0.6805555555555555 | 255.813 |
| 0.68125 | 237.564 |
| 0.6819444444444445 | 228.436 |
| 0.6826388888888889 | 223.873 |
| 0.6833333333333332 | 219.309 |
| 0.6840277777777778 | 214.746 |
| 0.6847222222222222 | 160.056 |
| 0.6854166666666667 | 123.758 |
| 0.686111111111111 | 205.62 |
| 0.6868055555555556 | 205.62 |
| 0.6875 | 210.182 |
| 0.6881944444444444 | 214.746 |
| 0.688888888888889 | 219.309 |
| 0.6895833333333333 | 214.746 |
| 0.6902777777777778 | 205.62 |
| 0.6909722222222222 | 196.497 |
| 0.6916666666666668 | 187.378 |
| 0.6923611111111111 | 187.378 |
| 0.6930555555555555 | 187.378 |
| 0.69375 | 182.82 |
| 0.6944444444444445 | 182.82 |
| 0.6951388888888889 | 182.82 |
| 0.6958333333333333 | 182.82 |
| 0.6965277777777777 | 178.264 |
| 0.6972222222222223 | 178.264 |
| 0.6979166666666666 | 178.264 |
| 0.6986111111111111 | 173.709 |
| 0.6993055555555556 | 173.709 |
| 0.7000000000000001 | 173.709 |
| 0.7006944444444444 | 169.156 |
| 0.7013888888888888 | 169.156 |
| 0.7020833333333334 | 169.156 |
| 0.7027777777777778 | 164.605 |
| 0.7034722222222222 | 164.605 |
| 0.7041666666666666 | 164.605 |
| 0.7048611111111112 | 164.605 |
| 0.7055555555555556 | 164.605 |
| 0.7062499999999999 | 164.605 |
| 0.7069444444444444 | 155.509 |
| 0.7076388888888889 | 164.605 |
| 0.7083333333333334 | 164.605 |
| 0.7090277777777777 | 164.605 |
| 0.7097222222222223 | 164.605 |
| 0.7104166666666667 | 164.605 |
| 0.7111111111111111 | 164.605 |
| 0.7118055555555555 | 164.605 |
| 0.7125 | 164.605 |
| 0.7131944444444445 | 164.605 |
| 0.7138888888888889 | 169.156 |
| 0.7145833333333332 | 169.156 |
| 0.7152777777777778 | 128.284 |
| 0.7159722222222222 | 150.964 |
| 0.7166666666666667 | 178.264 |
| 0.717361111111111 | 182.82 |
| 0.7180555555555556 | 164.605 |
| 0.71875 | 146.423 |
| 0.7194444444444444 | 173.709 |
| 0.720138888888889 | 128.284 |
| 0.7208333333333333 | 137.347 |
| 0.7215277777777778 | 155.509 |
| 0.7222222222222222 | 182.82 |
| 0.7229166666666668 | 150.964 |
| 0.7236111111111111 | 169.156 |
| 0.7243055555555555 | 201.058 |
| 0.725 | 191.937 |
| 0.7256944444444445 | 191.937 |
| 0.7263888888888889 | 187.378 |
| 0.7270833333333333 | 196.497 |
| 0.7277777777777777 | 182.82 |
| 0.7284722222222223 | 191.937 |
| 0.7291666666666666 | 205.62 |
| 0.7298611111111111 | 219.309 |
| 0.7305555555555556 | 223.873 |
| 0.7312500000000001 | 233 |
| 0.7319444444444444 | 237.564 |
| 0.7326388888888888 | 228.436 |
| 0.7333333333333334 | 223.873 |
| 0.7340277777777778 | 214.746 |
| 0.7347222222222222 | 214.746 |
| 0.7354166666666666 | 210.182 |
| 0.7361111111111112 | 210.182 |
| 0.7368055555555556 | 205.62 |
| 0.7374999999999999 | 196.497 |
| 0.7381944444444444 | 187.378 |
| 0.7388888888888889 | 178.264 |
| 0.7395833333333334 | 173.709 |
| 0.7402777777777777 | 173.709 |
| 0.7409722222222223 | 169.156 |
| 0.7416666666666667 | 160.056 |
| 0.7423611111111111 | 155.509 |
| 0.7430555555555555 | 146.423 |
| 0.74375 | 128.284 |
| 0.7444444444444445 | 137.347 |
| 0.7451388888888889 | 137.347 |
| 0.7458333333333332 | 137.347 |
| 0.7465277777777778 | 137.347 |
| 0.7472222222222222 | 137.347 |
| 0.7479166666666667 | 132.814 |
| 0.748611111111111 | 132.814 |
| 0.7493055555555556 | 123.758 |
| 0.75 | 128.284 |
| 0.7506944444444444 | 128.284 |
| 0.751388888888889 | 128.284 |
| 0.7520833333333333 | 123.758 |
| 0.7527777777777778 | 123.758 |
| 0.7534722222222222 | 123.758 |
| 0.7541666666666668 | 119.235 |
| 0.7548611111111111 | 119.235 |
| 0.7555555555555555 | 110.201 |
| 0.75625 | 119.235 |
| 0.7569444444444445 | 119.235 |
| 0.7576388888888889 | 114.716 |
| 0.7583333333333333 | 114.716 |
| 0.7590277777777777 | 114.716 |
| 0.7597222222222223 | 110.201 |
| 0.7604166666666666 | 110.201 |
| 0.7611111111111111 | 110.201 |
| 0.7618055555555556 | 110.201 |
| 0.7625000000000001 | 110.201 |
| 0.7631944444444444 | 110.201 |
| 0.7638888888888888 | 110.201 |
| 0.7645833333333334 | 110.201 |
| 0.7652777777777778 | 110.201 |
| 0.7659722222222222 | 96.682 |
| 0.7666666666666666 | 96.682 |
| 0.7673611111111112 | 101.184 |
| 0.7680555555555556 | 101.184 |
| 0.7687499999999999 | 101.184 |
| 0.7694444444444444 | 101.184 |
| 0.7701388888888889 | 101.184 |
| 0.7708333333333334 | 96.682 |
| 0.7715277777777777 | 96.682 |
| 0.7722222222222223 | 96.682 |
| 0.7729166666666667 | 96.682 |
| 0.7736111111111111 | 96.682 |
| 0.7743055555555555 | 96.682 |
| 0.775 | 96.682 |
| 0.7756944444444445 | 92.184 |
| 0.7763888888888889 | 92.184 |
| 0.7770833333333332 | 92.184 |
| 0.7777777777777778 | 96.682 |
| 0.7784722222222222 | 96.682 |
| 0.7791666666666667 | 96.682 |
| 0.779861111111111 | 92.184 |
| 0.7805555555555556 | 78.722 |
| 0.78125 | 74.246 |
| 0.7819444444444444 | 74.246 |
| 0.782638888888889 | 74.246 |
| 0.7833333333333333 | 83.205 |
| 0.7840277777777778 | 78.722 |
| 0.7847222222222222 | 78.722 |
| 0.7854166666666668 | 74.246 |
| 0.7861111111111111 | 74.246 |
| 0.7868055555555555 | 74.246 |
| 0.7875 | 74.246 |
| 0.7881944444444445 | 74.246 |
| 0.7888888888888889 | 78.722 |
| 0.7895833333333333 | 83.205 |
| 0.7902777777777777 | 83.205 |
| 0.7909722222222223 | 83.205 |
| 0.7916666666666666 | 78.722 |
| 0.7923611111111111 | 78.722 |
| 0.7930555555555556 | 74.246 |
| 0.7937500000000001 | 74.246 |
| 0.7944444444444444 | 69.775 |
| 0.7951388888888888 | 69.775 |
| 0.7958333333333334 | 65.31 |
| 0.7965277777777778 | 65.31 |
| 0.7972222222222222 | 65.31 |
| 0.7979166666666666 | 65.31 |
| 0.7986111111111112 | 65.31 |
| 0.7993055555555556 | 65.31 |
| 0.7999999999999999 | 65.31 |
| 0.8006944444444444 | 65.31 |
| 0.8013888888888889 | 65.31 |
| 0.8020833333333334 | 69.775 |
| 0.8027777777777777 | 69.775 |
| 0.8034722222222223 | 74.246 |
| 0.8041666666666667 | 74.246 |
| 0.8048611111111111 | 74.246 |
| 0.8055555555555555 | 78.722 |
| 0.80625 | 78.722 |
| 0.8069444444444445 | 83.205 |
| 0.8076388888888889 | 83.205 |
| 0.8083333333333332 | 78.722 |
| 0.8090277777777778 | 78.722 |
| 0.8097222222222222 | 78.722 |
| 0.8104166666666667 | 78.722 |
| 0.811111111111111 | 74.246 |
| 0.8118055555555556 | 74.246 |
| 0.8125 | 74.246 |
| 0.8131944444444444 | 74.246 |
| 0.813888888888889 | 74.246 |
| 0.8145833333333333 | 74.246 |
| 0.8152777777777778 | 74.246 |
| 0.8159722222222222 | 74.246 |
| 0.8166666666666668 | 74.246 |
| 0.8173611111111111 | 74.246 |
| 0.8180555555555555 | 74.246 |
| 0.81875 | 74.246 |
| 0.8194444444444445 | 74.246 |
| 0.8201388888888889 | 69.775 |
| 0.8208333333333333 | 69.775 |
| 0.8215277777777777 | 65.31 |
| 0.8222222222222223 | 65.31 |
| 0.8229166666666666 | 65.31 |
| 0.8236111111111111 | 60.85 |
| 0.8243055555555556 | 60.85 |
| 0.8250000000000001 | 56.398 |
| 0.8256944444444444 | 56.398 |
| 0.8263888888888888 | 56.398 |
| 0.8270833333333334 | 56.398 |
| 0.8277777777777778 | 56.398 |
| 0.8284722222222222 | 56.398 |
| 0.8291666666666666 | 51.951 |
| 0.8298611111111112 | 51.951 |
| 0.8305555555555556 | 51.951 |
| 0.8312499999999999 | 51.951 |
| 0.8319444444444444 | 51.951 |
| 0.8326388888888889 | 47.511 |
| 0.8333333333333334 | 47.511 |
| 0.8340277777777777 | 43.079 |
| 0.8347222222222223 | 38.653 |
| 0.8354166666666667 | 38.653 |
| 0.8361111111111111 | 34.234 |
| 0.8368055555555555 | 34.234 |
| 0.8375 | 29.823 |
| 0.8381944444444445 | 29.823 |
| 0.8388888888888889 | 25.419 |
| 0.8395833333333332 | 25.419 |
| 0.8402777777777778 | 25.419 |
| 0.8409722222222222 | 25.419 |
| 0.8416666666666667 | 21.024 |
| 0.842361111111111 | 21.024 |
| 0.8430555555555556 | 21.024 |
| 0.84375 | 16.636 |
| 0.8444444444444444 | 16.636 |
| 0.845138888888889 | 16.636 |
| 0.8458333333333333 | 16.636 |
| 0.8465277777777778 | 16.636 |
| 0.8472222222222222 | 12.257 |
| 0.8479166666666668 | 12.257 |
| 0.8486111111111111 | 12.257 |
| 0.8493055555555555 | 12.257 |
| 0.85 | 12.257 |
| 0.8506944444444445 | 12.257 |
| 0.8513888888888889 | 12.257 |
| 0.8520833333333333 | 7.887 |
| 0.8527777777777777 | 7.887 |
| 0.8534722222222223 | 7.887 |
| 0.8541666666666666 | 7.887 |
| 0.8548611111111111 | 3.525 |
| 0.8555555555555556 | 3.525 |
| 0.8562500000000001 | 3.525 |
| 0.8569444444444444 | 3.525 |
| 0.8576388888888888 | 3.525 |
| 0.8583333333333334 | 3.525 |
| 0.8590277777777778 | 3.525 |
| 0.8597222222222222 | 0 |
| 0.8604166666666666 | 0 |
| 0.8611111111111112 | 0 |
| 0.8618055555555556 | 0 |
| 0.8624999999999999 | 0 |
| 0.8631944444444444 | 0 |
| 0.8638888888888889 | 0 |
| 0.8645833333333334 | 0 |
| 0.8652777777777777 | 0 |
| 0.8659722222222223 | 0 |
| 0.8666666666666667 | 0 |
| 0.8673611111111111 | 0 |
| 0.8680555555555555 | 0 |
| 0.86875 | 0 |
| 0.8694444444444445 | 0 |
| 0.8701388888888889 | 0 |
| 0.8708333333333332 | 0 |
| 0.8715277777777778 | 0 |
| 0.8722222222222222 | 0 |
| 0.8729166666666667 | 0 |
| 0.873611111111111 | 0 |
| 0.8743055555555556 | 0 |
| 0.875 | 0 |
| 0.8756944444444444 | 0 |
| 0.876388888888889 | 0 |
| 0.8770833333333333 | 0 |
| 0.8777777777777778 | 0 |
| 0.8784722222222222 | 0 |
| 0.8791666666666668 | 0 |
| 0.8798611111111111 | 0 |
| 0.8805555555555555 | 0 |
| 0.88125 | 0 |
| 0.8819444444444445 | 0 |
| 0.8826388888888889 | 0 |
| 0.8833333333333333 | 0 |
| 0.8840277777777777 | 0 |
| 0.8847222222222223 | 0 |
| 0.8854166666666666 | 0 |
| 0.8861111111111111 | 0 |
| 0.8868055555555556 | 0 |
| 0.8875000000000001 | 0 |
| 0.8881944444444444 | 0 |
| 0.8888888888888888 | 0 |
| 0.8895833333333334 | 0 |
| 0.8902777777777778 | 0 |
| 0.8909722222222222 | 0 |
| 0.8916666666666666 | 0 |
| 0.8923611111111112 | 0 |
| 0.8930555555555556 | 0 |
| 0.8937499999999999 | 0 |
| 0.8944444444444444 | 0 |
| 0.8951388888888889 | 0 |
| 0.8958333333333334 | 0 |
| 0.8965277777777777 | 0 |
| 0.8972222222222223 | 0 |
| 0.8979166666666667 | 0 |
| 0.8986111111111111 | 0 |
| 0.8993055555555555 | 0 |
| 0.9 | 0 |
| 0.9006944444444445 | 0 |
| 0.9013888888888889 | 0 |
| 0.9020833333333332 | 0 |
| 0.9027777777777778 | 0 |
| 0.9034722222222222 | 0 |
| 0.9041666666666667 | 0 |
| 0.904861111111111 | 0 |
| 0.9055555555555556 | 0 |
| 0.90625 | 0 |
| 0.9069444444444444 | 0 |
| 0.907638888888889 | 0 |
| 0.9083333333333333 | 0 |
| 0.9090277777777778 | 0 |
| 0.9097222222222222 | 0 |
| 0.9104166666666668 | 0 |
| 0.9111111111111111 | 0 |
| 0.9118055555555555 | 0 |
| 0.9125 | 0 |
| 0.9131944444444445 | 0 |
| 0.9138888888888889 | 0 |
| 0.9145833333333333 | 0 |
| 0.9152777777777777 | 0 |
| 0.9159722222222223 | 0 |
| 0.9166666666666666 | 0 |
| 0.9173611111111111 | 0 |
| 0.9180555555555556 | 0 |
| 0.9187500000000001 | 0 |
| 0.9194444444444444 | 0 |
| 0.9201388888888888 | 0 |
| 0.9208333333333334 | 0 |
| 0.9215277777777778 | 0 |
| 0.9222222222222222 | 0 |
| 0.9229166666666666 | 0 |
| 0.9236111111111112 | 0 |
| 0.9243055555555556 | 0 |
| 0.9249999999999999 | 0 |
| 0.9256944444444444 | 0 |
| 0.9263888888888889 | 0 |
| 0.9270833333333334 | 0 |
| 0.9277777777777777 | 0 |
| 0.9284722222222223 | 0 |
| 0.9291666666666667 | 0 |
| 0.9298611111111111 | 0 |
| 0.9305555555555555 | 0 |
| 0.93125 | 0 |
| 0.9319444444444445 | 0 |
| 0.9326388888888889 | 0 |
| 0.9333333333333332 | 0 |
| 0.9340277777777778 | 0 |
| 0.9347222222222222 | 0 |
| 0.9354166666666667 | 0 |
| 0.936111111111111 | 0 |
| 0.9368055555555556 | 0 |
| 0.9375 | 0 |
| 0.9381944444444444 | 0 |
| 0.938888888888889 | 0 |
| 0.9395833333333333 | 0 |
| 0.9402777777777778 | 0 |
| 0.9409722222222222 | 0 |
| 0.9416666666666668 | 0 |
| 0.9423611111111111 | 0 |
| 0.9430555555555555 | 0 |
| 0.94375 | 0 |
| 0.9444444444444445 | 0 |
| 0.9451388888888889 | 0 |
| 0.9458333333333333 | 0 |
| 0.9465277777777777 | 0 |
| 0.9472222222222223 | 0 |
| 0.9479166666666666 | 0 |
| 0.9486111111111111 | 0 |
| 0.9493055555555556 | 0 |
| 0.9500000000000001 | 0 |
| 0.9506944444444444 | 0 |
| 0.9513888888888888 | 0 |
| 0.9520833333333334 | 0 |
| 0.9527777777777778 | 0 |
| 0.9534722222222222 | 0 |
| 0.9541666666666666 | 0 |
| 0.9548611111111112 | 0 |
| 0.9555555555555556 | 0 |
| 0.9562499999999999 | 0 |
| 0.9569444444444444 | 0 |
| 0.9576388888888889 | 0 |
| 0.9583333333333334 | 0 |
| 0.9590277777777777 | 0 |
| 0.9597222222222223 | 0 |
| 0.9604166666666667 | 0 |
| 0.9611111111111111 | 0 |
| 0.9618055555555555 | 0 |
| 0.9625 | 0 |
| 0.9631944444444445 | 0 |
| 0.9638888888888889 | 0 |
| 0.9645833333333332 | 0 |
| 0.9652777777777778 | 0 |
| 0.9659722222222222 | 0 |
| 0.9666666666666667 | 0 |
| 0.967361111111111 | 0 |
| 0.9680555555555556 | 0 |
| 0.96875 | 0 |
| 0.9694444444444444 | 0 |
| 0.970138888888889 | 0 |
| 0.9708333333333333 | 0 |
| 0.9715277777777778 | 0 |
| 0.9722222222222222 | 0 |
| 0.9729166666666668 | 0 |
| 0.9736111111111111 | 0 |
| 0.9743055555555555 | 0 |
| 0.975 | 0 |
| 0.9756944444444445 | 0 |
| 0.9763888888888889 | 0 |
| 0.9770833333333333 | 0 |
| 0.9777777777777777 | 0 |
| 0.9784722222222223 | 0 |
| 0.9791666666666666 | 0 |
| 0.9798611111111111 | 0 |
| 0.9805555555555556 | 0 |
| 0.9812500000000001 | 0 |
| 0.9819444444444444 | 0 |
| 0.9826388888888888 | 0 |
| 0.9833333333333334 | 0 |
| 0.9840277777777778 | 0 |
| 0.9847222222222222 | 0 |
| 0.9854166666666666 | 0 |
| 0.9861111111111112 | 0 |
| 0.9868055555555556 | 0 |
| 0.9874999999999999 | 0 |
| 0.9881944444444444 | 0 |
| 0.9888888888888889 | 0 |
| 0.9895833333333334 | 0 |
| 0.9902777777777777 | 0 |
| 0.9909722222222223 | 0 |
| 0.9916666666666667 | 0 |
| 0.9923611111111111 | 0 |
| 0.9930555555555555 | 0 |
| 0.99375 | 0 |
| 0.9944444444444445 | 0 |
| 0.9951388888888889 | 0 |
| 0.9958333333333332 | 0 |
| 0.9965277777777778 | 0 |
| 0.9972222222222222 | 0 |
| 0.9979166666666667 | 0 |
| 0.998611111111111 | 0 |
| 0.9993055555555556 | 0 |